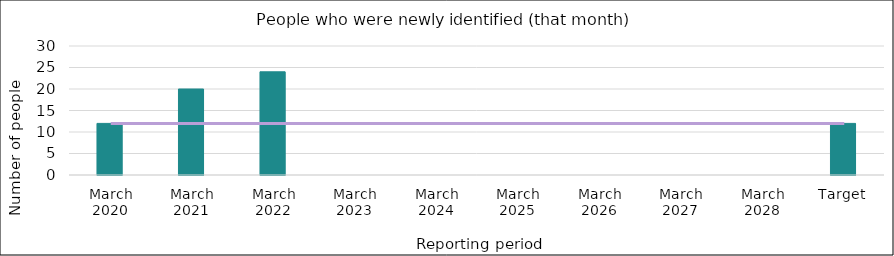
| Category | Series 0 |
|---|---|
| March 2020 | 12 |
| March 2021 | 20 |
| March 2022 | 24 |
| March 2023 | 0 |
| March 2024 | 0 |
| March 2025 | 0 |
| March 2026 | 0 |
| March 2027 | 0 |
| March 2028 | 0 |
| Target | 12 |